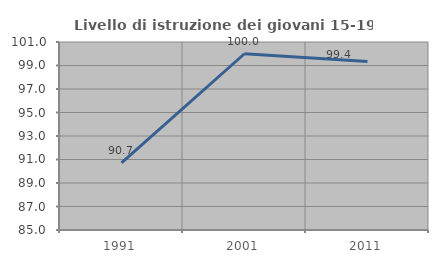
| Category | Livello di istruzione dei giovani 15-19 anni |
|---|---|
| 1991.0 | 90.714 |
| 2001.0 | 100 |
| 2011.0 | 99.351 |